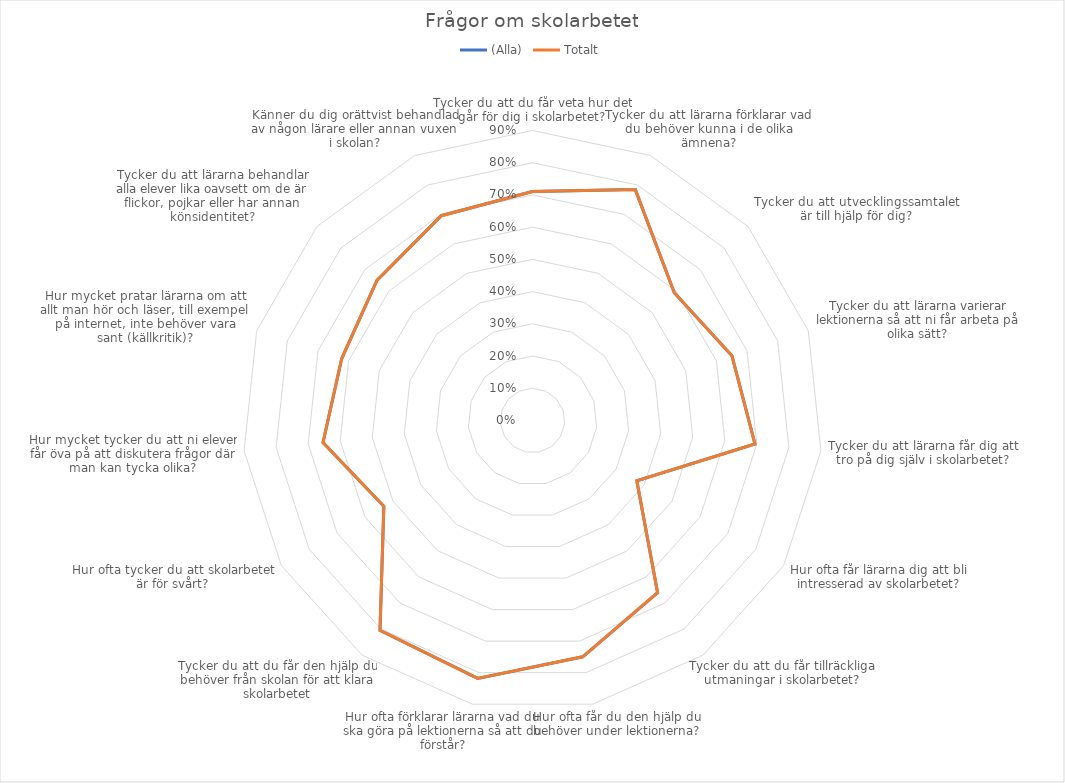
| Category | (Alla) | Totalt |
|---|---|---|
| Tycker du att du får veta hur det går för dig i skolarbetet? | 0.711 | 0.711 |
| Tycker du att lärarna förklarar vad du behöver kunna i de olika ämnena? | 0.784 | 0.784 |
| Tycker du att utvecklingssamtalet är till hjälp för dig? | 0.592 | 0.592 |
| Tycker du att lärarna varierar lektionerna så att ni får arbeta på olika sätt? | 0.651 | 0.651 |
| Tycker du att lärarna får dig att tro på dig själv i skolarbetet? | 0.694 | 0.694 |
| Hur ofta får lärarna dig att bli intresserad av skolarbetet? | 0.374 | 0.374 |
| Tycker du att du får tillräckliga utmaningar i skolarbetet? | 0.66 | 0.66 |
| Hur ofta får du den hjälp du behöver under lektionerna? | 0.75 | 0.75 |
| Hur ofta förklarar lärarna vad du ska göra på lektionerna så att du förstår? | 0.818 | 0.818 |
| Tycker du att du får den hjälp du behöver från skolan för att klara skolarbetet | 0.805 | 0.805 |
| Hur ofta tycker du att skolarbetet är för svårt? | 0.533 | 0.533 |
| Hur mycket tycker du att ni elever får öva på att diskutera frågor där man kan tycka olika? | 0.654 | 0.654 |
| Hur mycket pratar lärarna om att allt man hör och läser, till exempel på internet, inte behöver vara sant (källkritik)? | 0.622 | 0.622 |
| Tycker du att lärarna behandlar alla elever lika oavsett om de är flickor, pojkar eller har annan könsidentitet? | 0.65 | 0.65 |
| Känner du dig orättvist behandlad av någon lärare eller annan vuxen i skolan? | 0.696 | 0.696 |